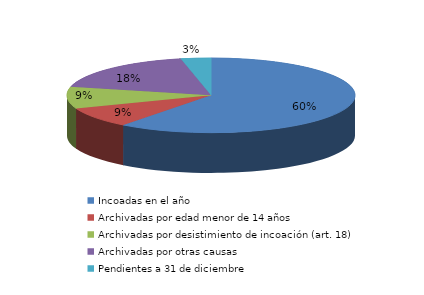
| Category | Series 0 |
|---|---|
| Incoadas en el año | 949 |
| Archivadas por edad menor de 14 años | 139 |
| Archivadas por desistimiento de incoación (art. 18) | 148 |
| Archivadas por otras causas | 282 |
| Pendientes a 31 de diciembre | 53 |